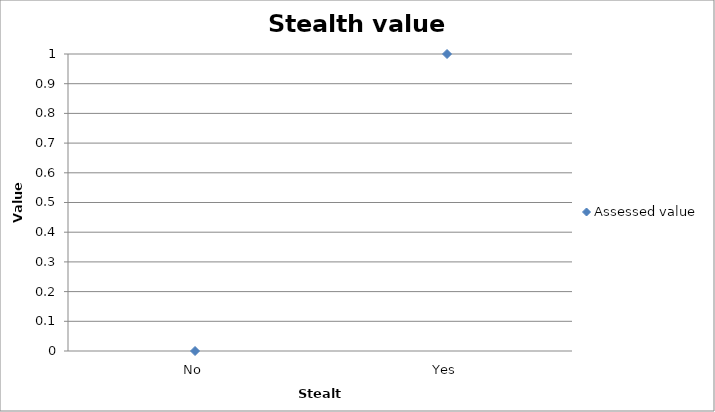
| Category | Assessed value |
|---|---|
| No | 0 |
| Yes | 1 |